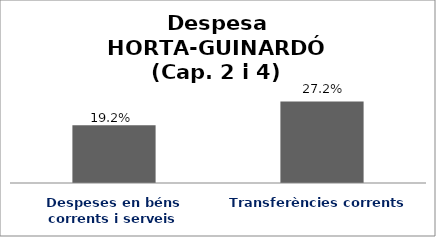
| Category | Series 0 |
|---|---|
| Despeses en béns corrents i serveis | 0.192 |
| Transferències corrents | 0.272 |